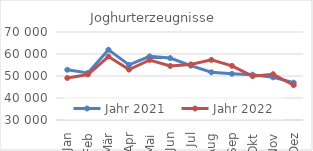
| Category | Jahr 2021 | Jahr 2022 |
|---|---|---|
| Jan | 52826.992 | 49110.195 |
| Feb | 51413.506 | 50677.036 |
| Mär | 61939.095 | 58845.403 |
| Apr | 55051.088 | 52901.836 |
| Mai | 58912.959 | 57269.631 |
| Jun | 58142.197 | 54564.816 |
| Jul | 54700.509 | 55250.108 |
| Aug | 51706.199 | 57331.306 |
| Sep | 50994.679 | 54635.572 |
| Okt | 50606.889 | 49918.852 |
| Nov | 49396.322 | 50832.531 |
| Dez | 46982.049 | 45814.67 |